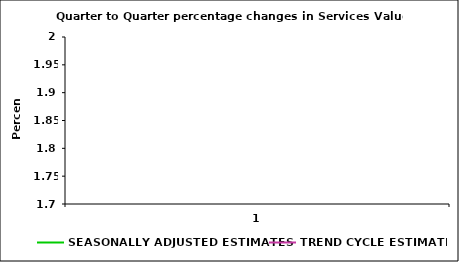
| Category | SEASONALLY ADJUSTED ESTIMATES | TREND CYCLE ESTIMATES |
|---|---|---|
| 0 | 1.943 | 1.785 |